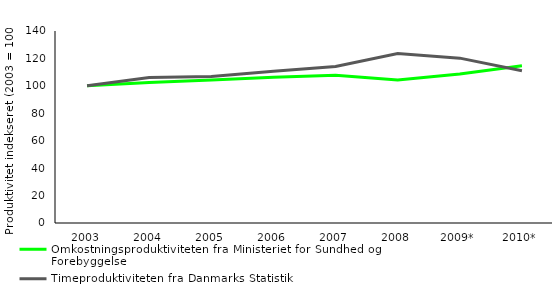
| Category | Omkostningsproduktiviteten fra Ministeriet for Sundhed og Forebyggelse | Timeproduktiviteten fra Danmarks Statistik |
|---|---|---|
| 2003 | 100 | 100 |
| 2004 | 102.4 | 106.119 |
| 2005 | 104.243 | 106.737 |
| 2006 | 106.224 | 110.615 |
| 2007 | 107.711 | 114.068 |
| 2008 | 104.264 | 123.558 |
| 2009* | 108.643 | 120.207 |
| 2010* | 114.727 | 110.98 |